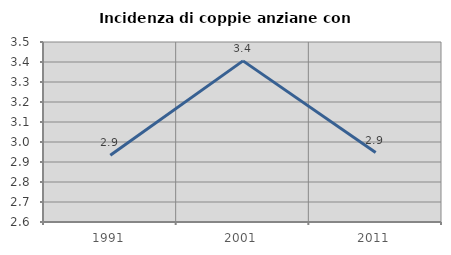
| Category | Incidenza di coppie anziane con figli |
|---|---|
| 1991.0 | 2.934 |
| 2001.0 | 3.406 |
| 2011.0 | 2.947 |